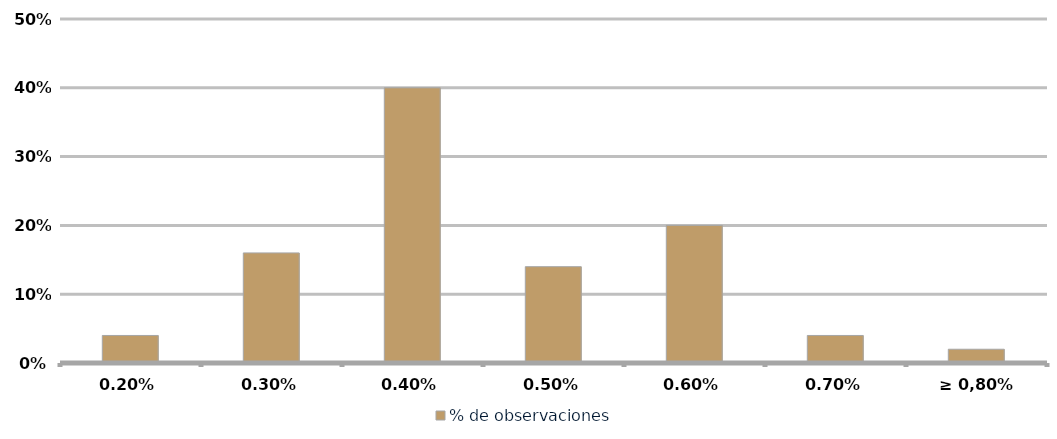
| Category | % de observaciones  |
|---|---|
| 0,20% | 0.04 |
| 0,30% | 0.16 |
| 0,40% | 0.4 |
| 0,50% | 0.14 |
| 0,60% | 0.2 |
| 0,70% | 0.04 |
| ≥ 0,80% | 0.02 |